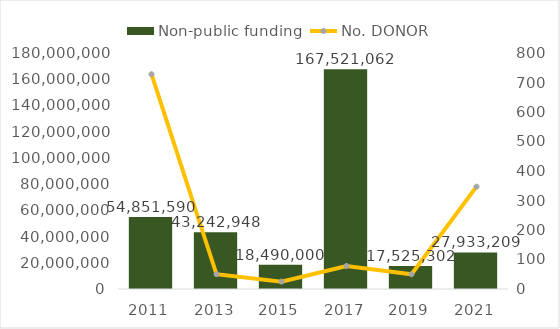
| Category | Non-public funding |
|---|---|
| 2011.0 | 54851590 |
| 2013.0 | 43242948 |
| 2015.0 | 18490000 |
| 2017.0 | 167521062 |
| 2019.0 | 17525302 |
| 2021.0 | 27933208.895 |